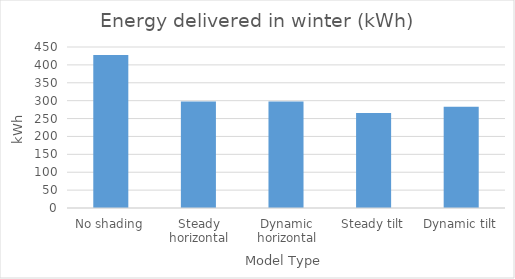
| Category | Series 0 |
|---|---|
| No shading | 427.57 |
| Steady horizontal | 297.51 |
| Dynamic horizontal | 297.51 |
| Steady tilt | 265.62 |
| Dynamic tilt | 282.72 |